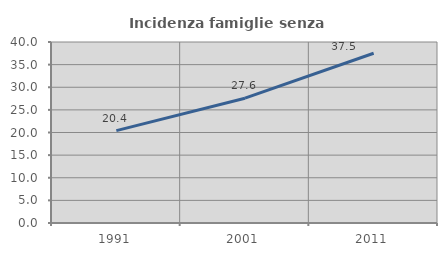
| Category | Incidenza famiglie senza nuclei |
|---|---|
| 1991.0 | 20.408 |
| 2001.0 | 27.582 |
| 2011.0 | 37.514 |